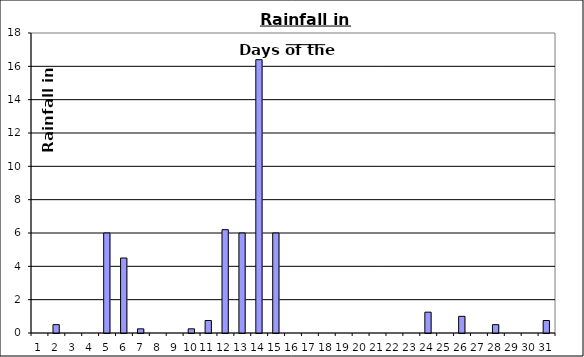
| Category | Series 0 |
|---|---|
| 0 | 0 |
| 1 | 0.5 |
| 2 | 0 |
| 3 | 0 |
| 4 | 6 |
| 5 | 4.5 |
| 6 | 0.25 |
| 7 | 0 |
| 8 | 0 |
| 9 | 0.25 |
| 10 | 0.75 |
| 11 | 6.2 |
| 12 | 6 |
| 13 | 16.4 |
| 14 | 6 |
| 15 | 0 |
| 16 | 0 |
| 17 | 0 |
| 18 | 0 |
| 19 | 0 |
| 20 | 0 |
| 21 | 0 |
| 22 | 0 |
| 23 | 1.25 |
| 24 | 0 |
| 25 | 1 |
| 26 | 0 |
| 27 | 0.5 |
| 28 | 0 |
| 29 | 0 |
| 30 | 0.75 |